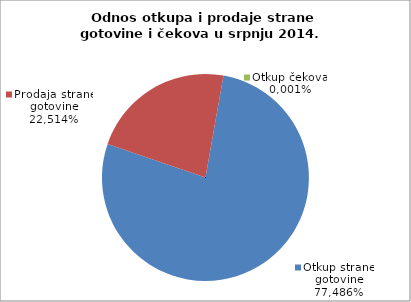
| Category | Otkup strane gotovine |
|---|---|
| 0 | 0.775 |
| 1 | 0.225 |
| 2 | 0 |